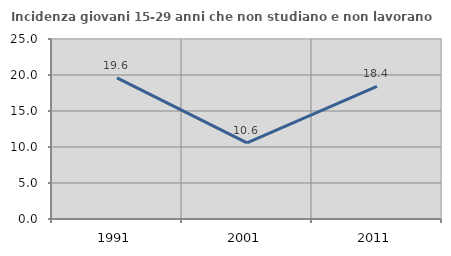
| Category | Incidenza giovani 15-29 anni che non studiano e non lavorano  |
|---|---|
| 1991.0 | 19.591 |
| 2001.0 | 10.569 |
| 2011.0 | 18.41 |